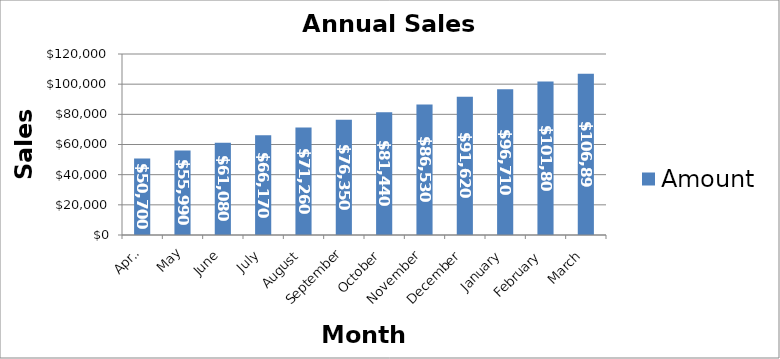
| Category | Amount |
|---|---|
| April | 50700 |
| May | 55990 |
| June | 61080 |
| July | 66170 |
| August | 71260 |
| September | 76350 |
| October | 81440 |
| November | 86530 |
| December | 91620 |
| January | 96710 |
| February | 101800 |
| March | 106890 |